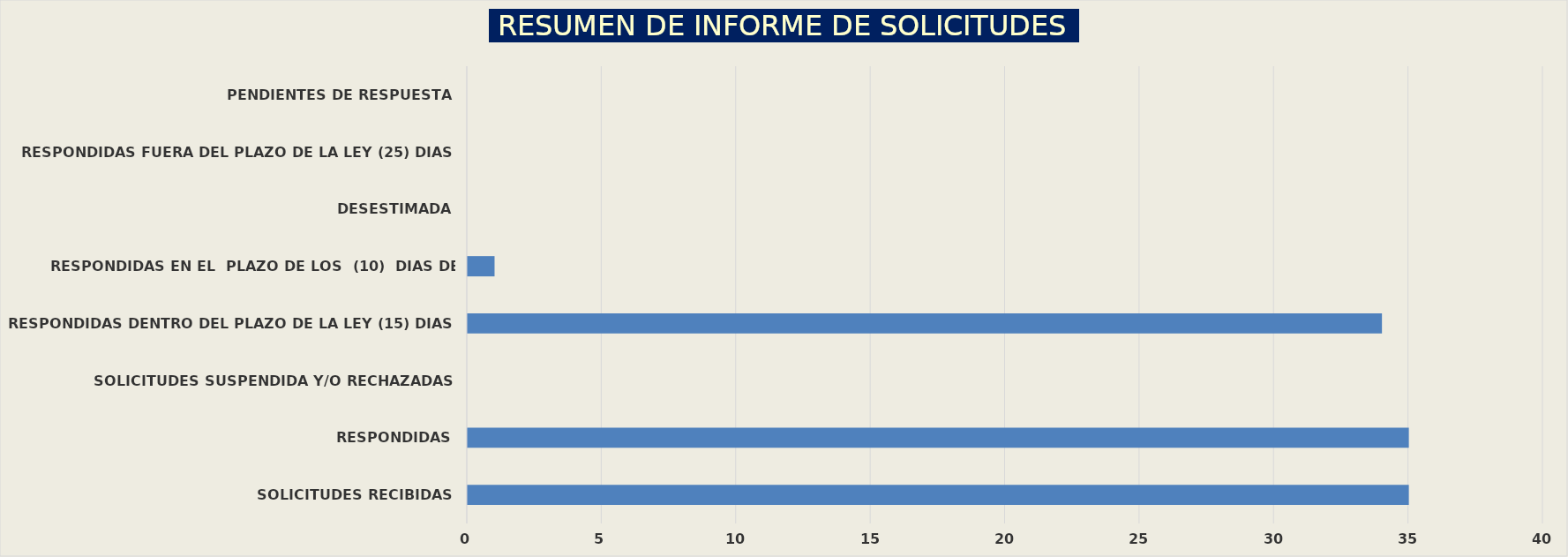
| Category | Series 0 |
|---|---|
| SOLICITUDES RECIBIDAS | 35 |
| RESPONDIDAS | 35 |
| SOLICITUDES SUSPENDIDA Y/O RECHAZADAS | 0 |
| RESPONDIDAS DENTRO DEL PLAZO DE LA LEY (15) DIAS | 34 |
| RESPONDIDAS EN EL  PLAZO DE LOS  (10)  DIAS DE PRORROGA | 1 |
| DESESTIMADA | 0 |
| RESPONDIDAS FUERA DEL PLAZO DE LA LEY (25) DIAS | 0 |
| PENDIENTES DE RESPUESTA | 0 |